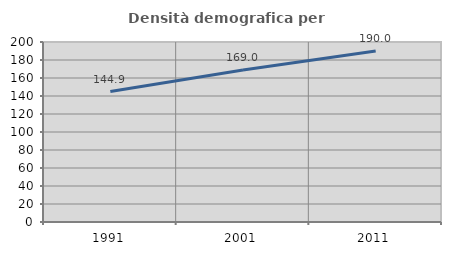
| Category | Densità demografica |
|---|---|
| 1991.0 | 144.892 |
| 2001.0 | 168.973 |
| 2011.0 | 190.022 |